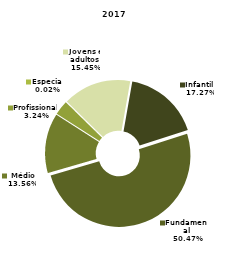
| Category | 2017 |
|---|---|
| Indígena | 0 |
| Infantil  | 7376 |
| Fundamental | 21559 |
| Médio | 5793 |
| Profissional  | 1386 |
| Especial | 7 |
| Jovens e adultos | 6598 |